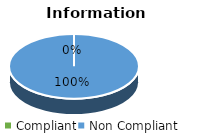
| Category | Series 4 | Series 3 | Series 2 | Series 1 | Series 0 |
|---|---|---|---|---|---|
| Compliant | 0 | 0 | 0 | 0 | 0 |
| Non Compliant | 4 | 4 | 8 | 9 | 10 |